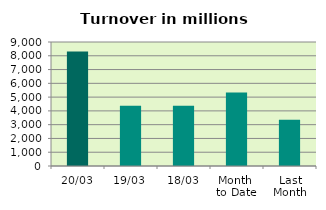
| Category | Series 0 |
|---|---|
| 20/03 | 8309.335 |
| 19/03 | 4372.924 |
| 18/03 | 4380.779 |
| Month 
to Date | 5332.875 |
| Last
Month | 3347.876 |